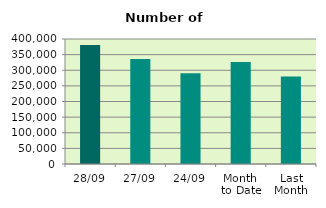
| Category | Series 0 |
|---|---|
| 28/09 | 380626 |
| 27/09 | 336336 |
| 24/09 | 290274 |
| Month 
to Date | 326686.5 |
| Last
Month | 279794.182 |